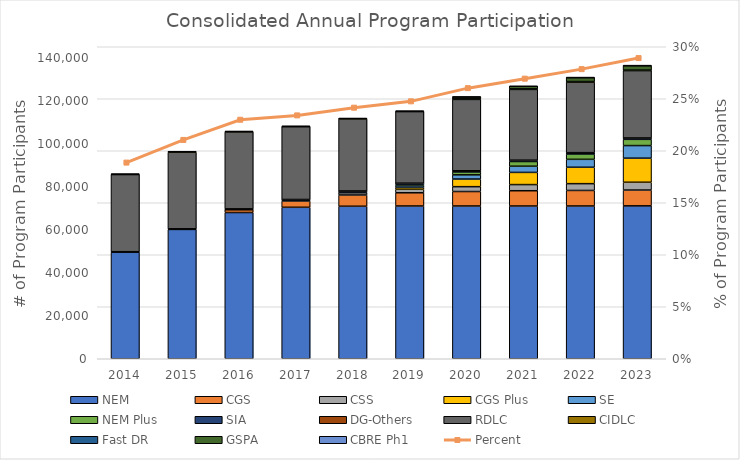
| Category | NEM | CGS | CSS | CGS Plus | SE | NEM Plus | SIA | DG-Others | RDLC | CIDLC | Fast DR | GSPA | CBRE Ph1 |
|---|---|---|---|---|---|---|---|---|---|---|---|---|---|
| 2014.0 | 49536 | 0 | 0 | 0 | 0 | 0 | 180 | 34 | 35850 | 196 | 46 | 0 | 0 |
| 2015.0 | 60107 | 0 | 0 | 0 | 0 | 0 | 248 | 36 | 35629 | 191 | 46 | 0 | 0 |
| 2016.0 | 67957 | 1363 | 7 | 0 | 0 | 0 | 290 | 39 | 35786 | 190 | 46 | 0 | 0 |
| 2017.0 | 70400 | 2923 | 309 | 0 | 0 | 0 | 346 | 40 | 33823 | 192 | 45 | 0 | 0 |
| 2018.0 | 70886 | 5216 | 1088 | 135 | 209 | 0 | 396 | 43 | 33495 | 192 | 43 | 0 | 0 |
| 2019.0 | 71001 | 6128 | 1659 | 970 | 950 | 395 | 453 | 46 | 33260 | 192 | 52 | 0 | 0 |
| 2020.0 | 71000 | 6719 | 2249 | 3543 | 1958 | 1354 | 493 | 47 | 33170 | 206 | 47 | 892 | 1 |
| 2021.0 | 70996 | 7092 | 2855 | 5661 | 2880 | 2183 | 579 | 47 | 32889 | 203 | 46 | 1199 | 1 |
| 2022.0 | 70999 | 7222 | 3151 | 7632 | 3677 | 2483 | 572 | 47 | 32802 | 203 | 43 | 1846 | 1 |
| 2023.0 | 71058 | 7344 | 3623 | 11194 | 5857 | 2897 | 592 | 47 | 31298 | 215 | 33 | 2069 | 1 |